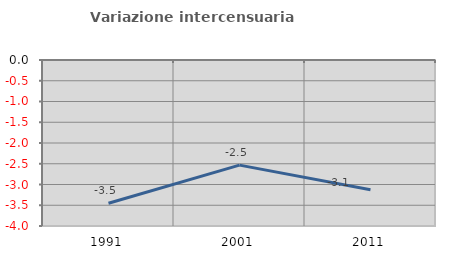
| Category | Variazione intercensuaria annua |
|---|---|
| 1991.0 | -3.453 |
| 2001.0 | -2.533 |
| 2011.0 | -3.126 |